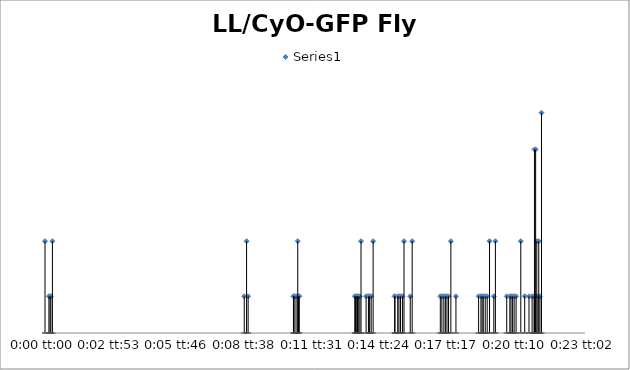
| Category | Series 0 |
|---|---|
| 0.0 | 5 |
| 0.00011574074074074958 | 2 |
| 0.00015046296296297723 | 2 |
| 0.0001736111111111105 | 2 |
| 0.00021990740740740478 | 5 |
| 0.005902777777777771 | 2 |
| 0.005972222222222226 | 5 |
| 0.00601851851851852 | 2 |
| 0.007372685185185204 | 2 |
| 0.007407407407407432 | 2 |
| 0.00736111111111111 | 2 |
| 0.007465277777777793 | 2 |
| 0.007488425925925926 | 5 |
| 0.007511574074074087 | 2 |
| 0.00753472222222222 | 2 |
| 0.009178240740740765 | 2 |
| 0.009201388888888898 | 2 |
| 0.009236111111111125 | 2 |
| 0.009259259259259259 | 2 |
| 0.00928240740740742 | 2 |
| 0.009328703703703714 | 2 |
| 0.009363425925925942 | 5 |
| 0.009513888888888891 | 2 |
| 0.009583333333333346 | 2 |
| 0.009618055555555574 | 2 |
| 0.00966435185185184 | 2 |
| 0.00972222222222223 | 5 |
| 0.01035879629629631 | 2 |
| 0.010370370370370377 | 2 |
| 0.010451388888888899 | 2 |
| 0.010486111111111127 | 2 |
| 0.010532407407407421 | 2 |
| 0.010590277777777782 | 2 |
| 0.010636574074074076 | 5 |
| 0.010821759259259281 | 2 |
| 0.010879629629629642 | 5 |
| 0.011712962962962967 | 2 |
| 0.011759259259259261 | 2 |
| 0.011817129629629622 | 2 |
| 0.011863425925925944 | 2 |
| 0.011909722222222238 | 2 |
| 0.011956018518518532 | 2 |
| 0.01202546296296296 | 5 |
| 0.012175925925925937 | 2 |
| 0.012847222222222246 | 2 |
| 0.012916666666666674 | 2 |
| 0.012951388888888901 | 2 |
| 0.012986111111111101 | 2 |
| 0.01304398148148149 | 2 |
| 0.013101851851851878 | 2 |
| 0.013171296296296306 | 5 |
| 0.013298611111111122 | 2 |
| 0.013344907407407416 | 5 |
| 0.013680555555555543 | 2 |
| 0.01377314814814816 | 2 |
| 0.013807870370370387 | 2 |
| 0.013854166666666681 | 2 |
| 0.013900462962962976 | 2 |
| 0.013958333333333336 | 2 |
| 0.01409722222222222 | 5 |
| 0.014212962962962969 | 2 |
| 0.014340277777777785 | 2 |
| 0.014432870370370374 | 2 |
| 0.014490740740740762 | 2 |
| 0.014502314814814829 | 10 |
| 0.01452546296296299 | 2 |
| 0.014537037037037029 | 10 |
| 0.014571759259259257 | 5 |
| 0.014606481481481484 | 2 |
| 0.014629629629629617 | 5 |
| 0.014664351851851845 | 2 |
| 0.014710648148148167 | 12 |